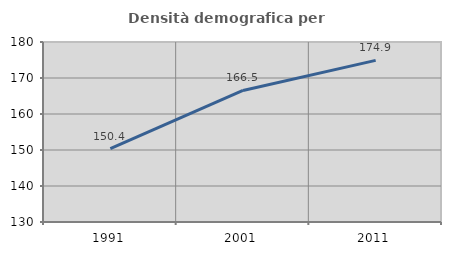
| Category | Densità demografica |
|---|---|
| 1991.0 | 150.402 |
| 2001.0 | 166.537 |
| 2011.0 | 174.893 |